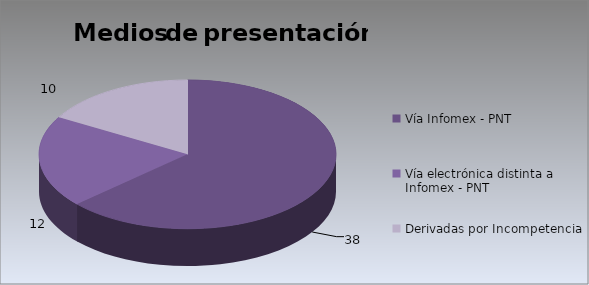
| Category | Series 0 |
|---|---|
| Vía Infomex - PNT | 38 |
| Vía electrónica distinta a Infomex - PNT | 12 |
| Derivadas por Incompetencia | 10 |